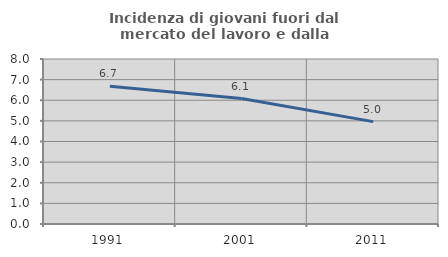
| Category | Incidenza di giovani fuori dal mercato del lavoro e dalla formazione  |
|---|---|
| 1991.0 | 6.681 |
| 2001.0 | 6.083 |
| 2011.0 | 4.965 |